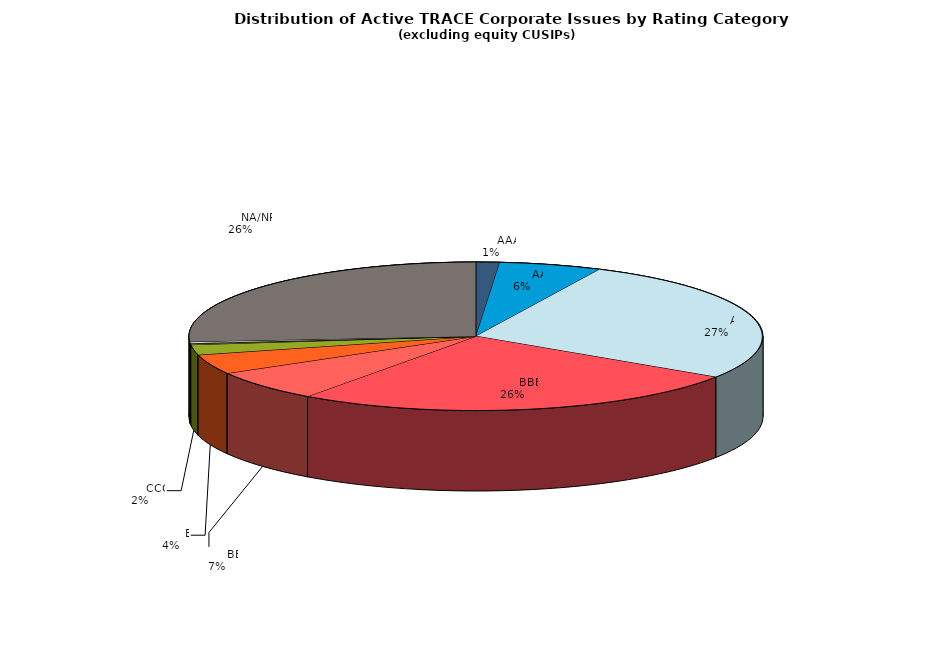
| Category | Series 0 |
|---|---|
|         AAA | 421 |
|         AA | 1832 |
|         A | 8603 |
|         BBB | 8147 |
|         BB | 2126 |
|         B | 1356 |
|         CCC | 701 |
|         CC | 60 |
|         C | 43 |
|         D | 104 |
|         NA/NR | 8286 |